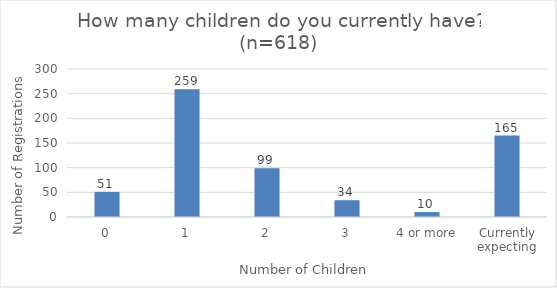
| Category | Series 0 |
|---|---|
| 0 | 51 |
| 1 | 259 |
| 2 | 99 |
| 3 | 34 |
| 4 or more | 10 |
| Currently expecting | 165 |